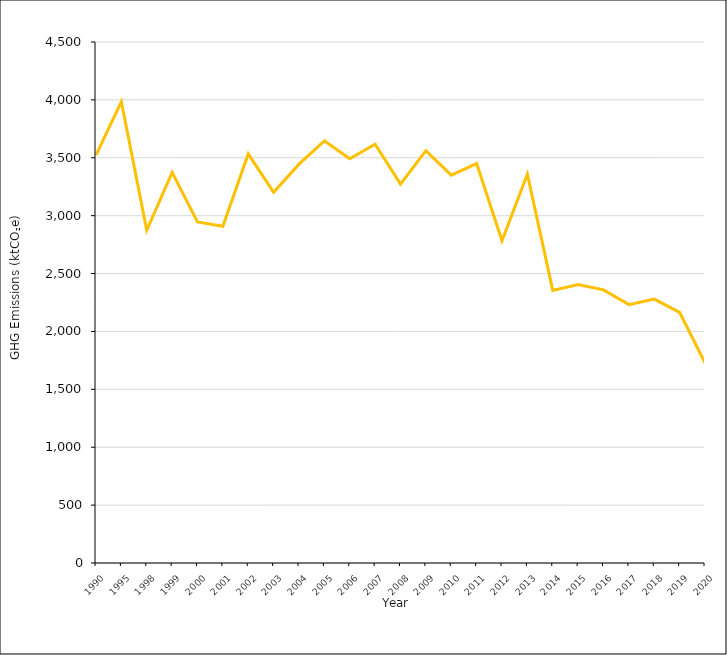
| Category | Emissions from petroleum refining (ktCO₂e) |
|---|---|
| 1990 | 3523.408 |
| 1995 | 3984.845 |
| 1998 | 2873.347 |
| 1999 | 3373.666 |
| 2000 | 2946.023 |
| 2001 | 2907.913 |
| 2002 | 3533.201 |
| 2003 | 3202.179 |
| 2004 | 3445.052 |
| 2005 | 3646.608 |
| 2006 | 3490.873 |
| 2007 | 3616.992 |
| 2008 | 3272.037 |
| 2009 | 3561.409 |
| 2010 | 3349.993 |
| 2011 | 3449.825 |
| 2012 | 2782.779 |
| 2013 | 3358.729 |
| 2014 | 2354.806 |
| 2015 | 2406.196 |
| 2016 | 2359.145 |
| 2017 | 2231.358 |
| 2018 | 2279.232 |
| 2019 | 2164.439 |
| 2020 | 1729.949 |